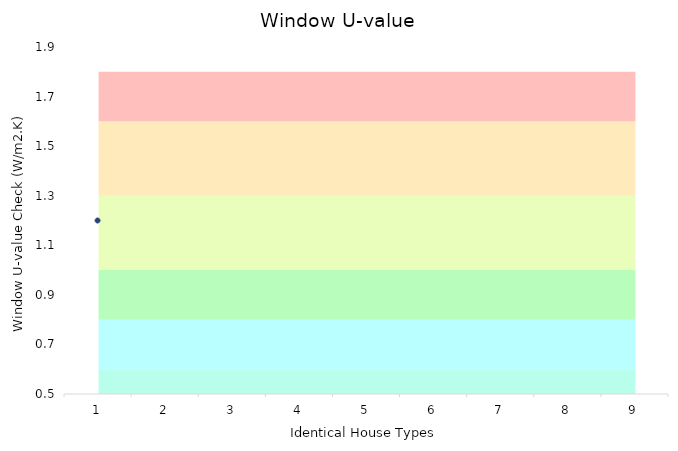
| Category | Series 1 | Series 2 | Series 3 | Series 4 | Series 5 | Series 0 |
|---|---|---|---|---|---|---|
| 0 | 0.6 | 0.2 | 0.2 | 0.3 | 0.3 | 0.2 |
| 1 | 0.6 | 0.2 | 0.2 | 0.3 | 0.3 | 0.2 |
| 2 | 0.6 | 0.2 | 0.2 | 0.3 | 0.3 | 0.2 |
| 3 | 0.6 | 0.2 | 0.2 | 0.3 | 0.3 | 0.2 |
| 4 | 0.6 | 0.2 | 0.2 | 0.3 | 0.3 | 0.2 |
| 5 | 0.6 | 0.2 | 0.2 | 0.3 | 0.3 | 0.2 |
| 6 | 0.6 | 0.2 | 0.2 | 0.3 | 0.3 | 0.2 |
| 7 | 0.6 | 0.2 | 0.2 | 0.3 | 0.3 | 0.2 |
| 8 | 0.6 | 0.2 | 0.2 | 0.3 | 0.3 | 0.2 |